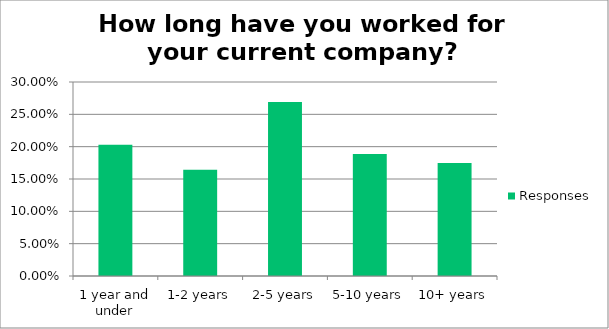
| Category | Responses |
|---|---|
| 1 year and under | 0.203 |
| 1-2 years | 0.164 |
| 2-5 years | 0.269 |
| 5-10 years | 0.189 |
| 10+ years | 0.175 |